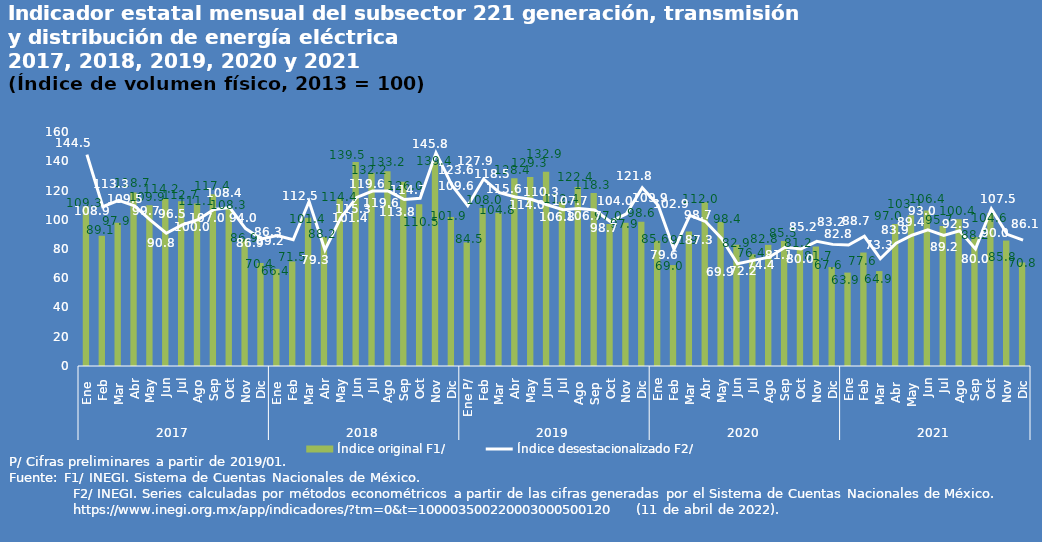
| Category | Índice original F1/ |
|---|---|
| 0 | 109.254 |
| 1 | 89.126 |
| 2 | 97.906 |
| 3 | 118.684 |
| 4 | 109.88 |
| 5 | 114.169 |
| 6 | 112.683 |
| 7 | 111.118 |
| 8 | 117.392 |
| 9 | 108.272 |
| 10 | 86.896 |
| 11 | 70.435 |
| 12 | 66.403 |
| 13 | 71.505 |
| 14 | 101.427 |
| 15 | 88.188 |
| 16 | 114.361 |
| 17 | 139.54 |
| 18 | 132.158 |
| 19 | 133.165 |
| 20 | 126.001 |
| 21 | 110.518 |
| 22 | 139.398 |
| 23 | 101.866 |
| 24 | 84.547 |
| 25 | 107.972 |
| 26 | 104.793 |
| 27 | 128.375 |
| 28 | 129.259 |
| 29 | 132.887 |
| 30 | 112.353 |
| 31 | 122.449 |
| 32 | 118.279 |
| 33 | 97.028 |
| 34 | 97.924 |
| 35 | 98.569 |
| 36 | 85.594 |
| 37 | 69.009 |
| 38 | 91.908 |
| 39 | 111.965 |
| 40 | 98.395 |
| 41 | 82.946 |
| 42 | 76.407 |
| 43 | 82.838 |
| 44 | 85.514 |
| 45 | 81.159 |
| 46 | 81.709 |
| 47 | 67.61 |
| 48 | 63.866 |
| 49 | 77.589 |
| 50 | 64.892 |
| 51 | 97.015 |
| 52 | 103.076 |
| 53 | 106.408 |
| 54 | 95.688 |
| 55 | 100.413 |
| 56 | 88.181 |
| 57 | 104.643 |
| 58 | 85.755 |
| 59 | 70.791 |